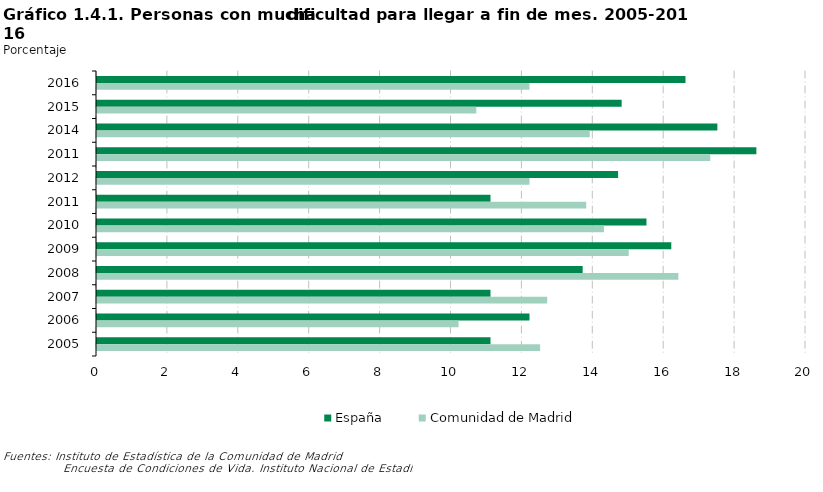
| Category | España | Comunidad de Madrid |
|---|---|---|
| 2016 | 16.6 | 12.2 |
| 2015 | 14.8 | 10.7 |
| 2014 | 17.5 | 13.9 |
| 2011 | 18.6 | 17.3 |
| 2012 | 14.7 | 12.2 |
| 2011 | 11.1 | 13.8 |
| 2010 | 15.5 | 14.3 |
| 2009 | 16.2 | 15 |
| 2008 | 13.7 | 16.4 |
| 2007 | 11.1 | 12.7 |
| 2006 | 12.2 | 10.2 |
| 2005 | 11.1 | 12.5 |